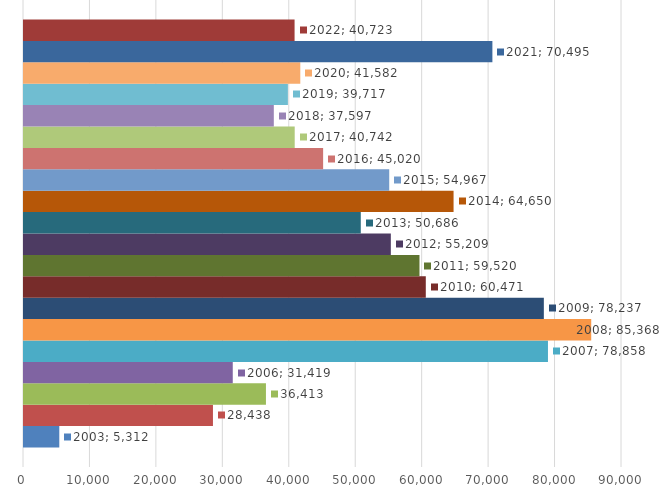
| Category | 2003 | 2004 | 2005 | 2006 | 2007 | 2008 | 2009 | 2010 | 2011 | 2012 | 2013 | 2014 | 2015 | 2016 | 2017 | 2018 | 2019 | 2020 | 2021 | 2022 |
|---|---|---|---|---|---|---|---|---|---|---|---|---|---|---|---|---|---|---|---|---|
| 0 | 5312 | 28438 | 36413 | 31419 | 78858 | 85368 | 78237 | 60471 | 59520 | 55209 | 50686 | 64650 | 54967 | 45020 | 40742 | 37597 | 39717 | 41582 | 70495 | 40723 |